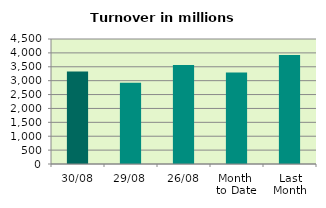
| Category | Series 0 |
|---|---|
| 30/08 | 3329.253 |
| 29/08 | 2923.398 |
| 26/08 | 3563.769 |
| Month 
to Date | 3295.482 |
| Last
Month | 3920.999 |